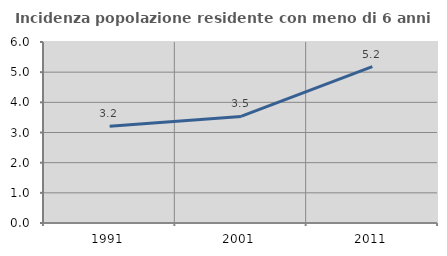
| Category | Incidenza popolazione residente con meno di 6 anni |
|---|---|
| 1991.0 | 3.203 |
| 2001.0 | 3.533 |
| 2011.0 | 5.181 |